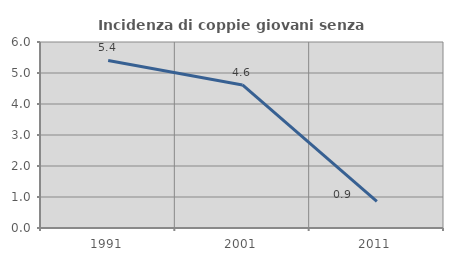
| Category | Incidenza di coppie giovani senza figli |
|---|---|
| 1991.0 | 5.405 |
| 2001.0 | 4.615 |
| 2011.0 | 0.862 |